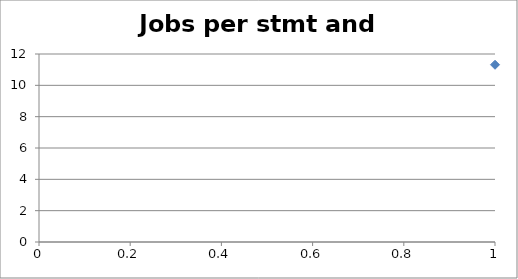
| Category | Series 0 |
|---|---|
| 0 | 11.314 |
| 1 | 6.469 |
| 2 | 6.057 |
| 3 | 4.716 |
| 4 | 4.632 |
| 5 | 4.14 |
| 6 | 3.902 |
| 7 | 3.747 |
| 8 | 3.707 |
| 9 | 3.391 |
| 10 | 3.305 |
| 11 | 3.28 |
| 12 | 3.25 |
| 13 | 3.205 |
| 14 | 3.159 |
| 15 | 3.149 |
| 16 | 3.143 |
| 17 | 3.132 |
| 18 | 3.122 |
| 19 | 3.086 |
| 20 | 3.077 |
| 21 | 3.064 |
| 22 | 2.953 |
| 23 | 2.95 |
| 24 | 2.93 |
| 25 | 2.909 |
| 26 | 2.894 |
| 27 | 2.862 |
| 28 | 2.852 |
| 29 | 2.85 |
| 30 | 2.796 |
| 31 | 2.765 |
| 32 | 2.75 |
| 33 | 2.721 |
| 34 | 2.717 |
| 35 | 2.717 |
| 36 | 2.71 |
| 37 | 2.639 |
| 38 | 2.625 |
| 39 | 2.577 |
| 40 | 2.571 |
| 41 | 2.562 |
| 42 | 2.535 |
| 43 | 2.517 |
| 44 | 2.475 |
| 45 | 2.472 |
| 46 | 2.469 |
| 47 | 2.466 |
| 48 | 2.463 |
| 49 | 2.46 |
| 50 | 2.443 |
| 51 | 2.425 |
| 52 | 2.421 |
| 53 | 2.412 |
| 54 | 2.408 |
| 55 | 2.361 |
| 56 | 2.346 |
| 57 | 2.321 |
| 58 | 2.317 |
| 59 | 2.286 |
| 60 | 2.286 |
| 61 | 2.283 |
| 62 | 2.28 |
| 63 | 2.259 |
| 64 | 2.25 |
| 65 | 2.2 |
| 66 | 2.138 |
| 67 | 2.134 |
| 68 | 2.111 |
| 69 | 2.097 |
| 70 | 2.079 |
| 71 | 2.07 |
| 72 | 2.068 |
| 73 | 2.05 |
| 74 | 2.036 |
| 75 | 2.034 |
| 76 | 2.029 |
| 77 | 2.022 |
| 78 | 2.017 |
| 79 | 2.012 |
| 80 | 1.993 |
| 81 | 1.973 |
| 82 | 1.953 |
| 83 | 1.948 |
| 84 | 1.946 |
| 85 | 1.94 |
| 86 | 1.931 |
| 87 | 1.929 |
| 88 | 1.926 |
| 89 | 1.921 |
| 90 | 1.917 |
| 91 | 1.916 |
| 92 | 1.911 |
| 93 | 1.909 |
| 94 | 1.9 |
| 95 | 1.893 |
| 96 | 1.892 |
| 97 | 1.885 |
| 98 | 1.884 |
| 99 | 1.88 |
| 100 | 1.874 |
| 101 | 1.859 |
| 102 | 1.852 |
| 103 | 1.852 |
| 104 | 1.838 |
| 105 | 1.833 |
| 106 | 1.816 |
| 107 | 1.811 |
| 108 | 1.806 |
| 109 | 1.804 |
| 110 | 1.798 |
| 111 | 1.794 |
| 112 | 1.792 |
| 113 | 1.774 |
| 114 | 1.773 |
| 115 | 1.772 |
| 116 | 1.765 |
| 117 | 1.76 |
| 118 | 1.758 |
| 119 | 1.756 |
| 120 | 1.75 |
| 121 | 1.748 |
| 122 | 1.746 |
| 123 | 1.745 |
| 124 | 1.745 |
| 125 | 1.744 |
| 126 | 1.732 |
| 127 | 1.73 |
| 128 | 1.723 |
| 129 | 1.721 |
| 130 | 1.717 |
| 131 | 1.716 |
| 132 | 1.712 |
| 133 | 1.711 |
| 134 | 1.711 |
| 135 | 1.698 |
| 136 | 1.696 |
| 137 | 1.696 |
| 138 | 1.689 |
| 139 | 1.688 |
| 140 | 1.688 |
| 141 | 1.684 |
| 142 | 1.681 |
| 143 | 1.681 |
| 144 | 1.681 |
| 145 | 1.68 |
| 146 | 1.679 |
| 147 | 1.672 |
| 148 | 1.667 |
| 149 | 1.667 |
| 150 | 1.667 |
| 151 | 1.662 |
| 152 | 1.661 |
| 153 | 1.656 |
| 154 | 1.647 |
| 155 | 1.646 |
| 156 | 1.645 |
| 157 | 1.632 |
| 158 | 1.63 |
| 159 | 1.625 |
| 160 | 1.625 |
| 161 | 1.625 |
| 162 | 1.621 |
| 163 | 1.62 |
| 164 | 1.62 |
| 165 | 1.619 |
| 166 | 1.615 |
| 167 | 1.615 |
| 168 | 1.615 |
| 169 | 1.613 |
| 170 | 1.611 |
| 171 | 1.609 |
| 172 | 1.604 |
| 173 | 1.6 |
| 174 | 1.6 |
| 175 | 1.6 |
| 176 | 1.591 |
| 177 | 1.587 |
| 178 | 1.585 |
| 179 | 1.58 |
| 180 | 1.58 |
| 181 | 1.579 |
| 182 | 1.578 |
| 183 | 1.578 |
| 184 | 1.574 |
| 185 | 1.571 |
| 186 | 1.571 |
| 187 | 1.566 |
| 188 | 1.565 |
| 189 | 1.564 |
| 190 | 1.56 |
| 191 | 1.56 |
| 192 | 1.559 |
| 193 | 1.556 |
| 194 | 1.556 |
| 195 | 1.552 |
| 196 | 1.551 |
| 197 | 1.551 |
| 198 | 1.548 |
| 199 | 1.543 |
| 200 | 1.543 |
| 201 | 1.538 |
| 202 | 1.532 |
| 203 | 1.531 |
| 204 | 1.524 |
| 205 | 1.521 |
| 206 | 1.512 |
| 207 | 1.51 |
| 208 | 1.51 |
| 209 | 1.508 |
| 210 | 1.507 |
| 211 | 1.504 |
| 212 | 1.5 |
| 213 | 1.5 |
| 214 | 1.49 |
| 215 | 1.486 |
| 216 | 1.484 |
| 217 | 1.481 |
| 218 | 1.48 |
| 219 | 1.475 |
| 220 | 1.473 |
| 221 | 1.469 |
| 222 | 1.467 |
| 223 | 1.463 |
| 224 | 1.462 |
| 225 | 1.46 |
| 226 | 1.456 |
| 227 | 1.452 |
| 228 | 1.452 |
| 229 | 1.439 |
| 230 | 1.438 |
| 231 | 1.438 |
| 232 | 1.438 |
| 233 | 1.435 |
| 234 | 1.433 |
| 235 | 1.432 |
| 236 | 1.431 |
| 237 | 1.425 |
| 238 | 1.424 |
| 239 | 1.422 |
| 240 | 1.421 |
| 241 | 1.411 |
| 242 | 1.41 |
| 243 | 1.408 |
| 244 | 1.406 |
| 245 | 1.406 |
| 246 | 1.404 |
| 247 | 1.403 |
| 248 | 1.403 |
| 249 | 1.4 |
| 250 | 1.4 |
| 251 | 1.4 |
| 252 | 1.397 |
| 253 | 1.396 |
| 254 | 1.387 |
| 255 | 1.382 |
| 256 | 1.382 |
| 257 | 1.382 |
| 258 | 1.375 |
| 259 | 1.374 |
| 260 | 1.371 |
| 261 | 1.368 |
| 262 | 1.368 |
| 263 | 1.367 |
| 264 | 1.366 |
| 265 | 1.365 |
| 266 | 1.365 |
| 267 | 1.364 |
| 268 | 1.364 |
| 269 | 1.364 |
| 270 | 1.364 |
| 271 | 1.361 |
| 272 | 1.361 |
| 273 | 1.36 |
| 274 | 1.36 |
| 275 | 1.356 |
| 276 | 1.355 |
| 277 | 1.353 |
| 278 | 1.353 |
| 279 | 1.351 |
| 280 | 1.351 |
| 281 | 1.349 |
| 282 | 1.349 |
| 283 | 1.348 |
| 284 | 1.348 |
| 285 | 1.345 |
| 286 | 1.344 |
| 287 | 1.343 |
| 288 | 1.342 |
| 289 | 1.339 |
| 290 | 1.339 |
| 291 | 1.333 |
| 292 | 1.333 |
| 293 | 1.333 |
| 294 | 1.333 |
| 295 | 1.33 |
| 296 | 1.326 |
| 297 | 1.325 |
| 298 | 1.325 |
| 299 | 1.324 |
| 300 | 1.324 |
| 301 | 1.324 |
| 302 | 1.323 |
| 303 | 1.32 |
| 304 | 1.319 |
| 305 | 1.318 |
| 306 | 1.318 |
| 307 | 1.316 |
| 308 | 1.316 |
| 309 | 1.316 |
| 310 | 1.316 |
| 311 | 1.316 |
| 312 | 1.316 |
| 313 | 1.316 |
| 314 | 1.316 |
| 315 | 1.314 |
| 316 | 1.314 |
| 317 | 1.311 |
| 318 | 1.311 |
| 319 | 1.31 |
| 320 | 1.31 |
| 321 | 1.31 |
| 322 | 1.31 |
| 323 | 1.309 |
| 324 | 1.309 |
| 325 | 1.308 |
| 326 | 1.307 |
| 327 | 1.307 |
| 328 | 1.306 |
| 329 | 1.306 |
| 330 | 1.306 |
| 331 | 1.304 |
| 332 | 1.303 |
| 333 | 1.303 |
| 334 | 1.303 |
| 335 | 1.302 |
| 336 | 1.302 |
| 337 | 1.301 |
| 338 | 1.3 |
| 339 | 1.297 |
| 340 | 1.297 |
| 341 | 1.294 |
| 342 | 1.294 |
| 343 | 1.293 |
| 344 | 1.293 |
| 345 | 1.292 |
| 346 | 1.29 |
| 347 | 1.289 |
| 348 | 1.289 |
| 349 | 1.289 |
| 350 | 1.289 |
| 351 | 1.288 |
| 352 | 1.288 |
| 353 | 1.286 |
| 354 | 1.286 |
| 355 | 1.284 |
| 356 | 1.283 |
| 357 | 1.283 |
| 358 | 1.283 |
| 359 | 1.283 |
| 360 | 1.283 |
| 361 | 1.282 |
| 362 | 1.282 |
| 363 | 1.281 |
| 364 | 1.28 |
| 365 | 1.28 |
| 366 | 1.279 |
| 367 | 1.279 |
| 368 | 1.278 |
| 369 | 1.278 |
| 370 | 1.277 |
| 371 | 1.275 |
| 372 | 1.275 |
| 373 | 1.273 |
| 374 | 1.273 |
| 375 | 1.271 |
| 376 | 1.271 |
| 377 | 1.268 |
| 378 | 1.267 |
| 379 | 1.266 |
| 380 | 1.265 |
| 381 | 1.265 |
| 382 | 1.264 |
| 383 | 1.263 |
| 384 | 1.263 |
| 385 | 1.262 |
| 386 | 1.262 |
| 387 | 1.262 |
| 388 | 1.261 |
| 389 | 1.261 |
| 390 | 1.258 |
| 391 | 1.258 |
| 392 | 1.257 |
| 393 | 1.256 |
| 394 | 1.255 |
| 395 | 1.255 |
| 396 | 1.251 |
| 397 | 1.25 |
| 398 | 1.25 |
| 399 | 1.25 |
| 400 | 1.25 |
| 401 | 1.25 |
| 402 | 1.25 |
| 403 | 1.246 |
| 404 | 1.246 |
| 405 | 1.245 |
| 406 | 1.244 |
| 407 | 1.242 |
| 408 | 1.24 |
| 409 | 1.239 |
| 410 | 1.238 |
| 411 | 1.235 |
| 412 | 1.235 |
| 413 | 1.235 |
| 414 | 1.234 |
| 415 | 1.233 |
| 416 | 1.232 |
| 417 | 1.232 |
| 418 | 1.231 |
| 419 | 1.231 |
| 420 | 1.231 |
| 421 | 1.229 |
| 422 | 1.229 |
| 423 | 1.226 |
| 424 | 1.225 |
| 425 | 1.224 |
| 426 | 1.224 |
| 427 | 1.224 |
| 428 | 1.223 |
| 429 | 1.222 |
| 430 | 1.222 |
| 431 | 1.222 |
| 432 | 1.222 |
| 433 | 1.222 |
| 434 | 1.222 |
| 435 | 1.221 |
| 436 | 1.22 |
| 437 | 1.218 |
| 438 | 1.217 |
| 439 | 1.217 |
| 440 | 1.215 |
| 441 | 1.211 |
| 442 | 1.21 |
| 443 | 1.21 |
| 444 | 1.21 |
| 445 | 1.206 |
| 446 | 1.205 |
| 447 | 1.204 |
| 448 | 1.203 |
| 449 | 1.203 |
| 450 | 1.202 |
| 451 | 1.2 |
| 452 | 1.2 |
| 453 | 1.2 |
| 454 | 1.2 |
| 455 | 1.196 |
| 456 | 1.196 |
| 457 | 1.196 |
| 458 | 1.196 |
| 459 | 1.196 |
| 460 | 1.196 |
| 461 | 1.194 |
| 462 | 1.19 |
| 463 | 1.19 |
| 464 | 1.188 |
| 465 | 1.188 |
| 466 | 1.185 |
| 467 | 1.185 |
| 468 | 1.183 |
| 469 | 1.183 |
| 470 | 1.183 |
| 471 | 1.179 |
| 472 | 1.179 |
| 473 | 1.177 |
| 474 | 1.176 |
| 475 | 1.175 |
| 476 | 1.175 |
| 477 | 1.174 |
| 478 | 1.174 |
| 479 | 1.173 |
| 480 | 1.167 |
| 481 | 1.165 |
| 482 | 1.164 |
| 483 | 1.162 |
| 484 | 1.16 |
| 485 | 1.158 |
| 486 | 1.157 |
| 487 | 1.157 |
| 488 | 1.156 |
| 489 | 1.156 |
| 490 | 1.156 |
| 491 | 1.156 |
| 492 | 1.156 |
| 493 | 1.155 |
| 494 | 1.153 |
| 495 | 1.153 |
| 496 | 1.153 |
| 497 | 1.151 |
| 498 | 1.15 |
| 499 | 1.148 |
| 500 | 1.147 |
| 501 | 1.145 |
| 502 | 1.144 |
| 503 | 1.141 |
| 504 | 1.14 |
| 505 | 1.139 |
| 506 | 1.138 |
| 507 | 1.136 |
| 508 | 1.135 |
| 509 | 1.133 |
| 510 | 1.133 |
| 511 | 1.132 |
| 512 | 1.127 |
| 513 | 1.127 |
| 514 | 1.125 |
| 515 | 1.123 |
| 516 | 1.117 |
| 517 | 1.113 |
| 518 | 1.108 |
| 519 | 1.107 |
| 520 | 1.107 |
| 521 | 1.103 |
| 522 | 1.102 |
| 523 | 1.091 |
| 524 | 1.091 |
| 525 | 1.075 |
| 526 | 1.073 |
| 527 | 1.071 |
| 528 | 1.071 |
| 529 | 1.07 |
| 530 | 1.07 |
| 531 | 1.069 |
| 532 | 1.067 |
| 533 | 1.062 |
| 534 | 1.061 |
| 535 | 1.06 |
| 536 | 1.057 |
| 537 | 1.054 |
| 538 | 1.053 |
| 539 | 1.053 |
| 540 | 1.047 |
| 541 | 1.046 |
| 542 | 1.045 |
| 543 | 1.041 |
| 544 | 1.035 |
| 545 | 1.034 |
| 546 | 1.032 |
| 547 | 1.028 |
| 548 | 1.02 |
| 549 | 0.99 |
| 550 | 0.986 |
| 551 | 0.962 |
| 552 | 0.961 |
| 553 | 0.957 |
| 554 | 0.956 |
| 555 | 0.946 |
| 556 | 0.94 |
| 557 | 0.938 |
| 558 | 0.93 |
| 559 | 0.919 |
| 560 | 0.917 |
| 561 | 0.903 |
| 562 | 0.883 |
| 563 | 0.881 |
| 564 | 0.876 |
| 565 | 0.871 |
| 566 | 0.857 |
| 567 | 0.855 |
| 568 | 0.851 |
| 569 | 0.849 |
| 570 | 0.844 |
| 571 | 0.843 |
| 572 | 0.837 |
| 573 | 0.836 |
| 574 | 0.821 |
| 575 | 0.805 |
| 576 | 0.79 |
| 577 | 0.781 |
| 578 | 0.774 |
| 579 | 0.773 |
| 580 | 0.772 |
| 581 | 0.76 |
| 582 | 0.757 |
| 583 | 0.756 |
| 584 | 0.75 |
| 585 | 0.75 |
| 586 | 0.747 |
| 587 | 0.744 |
| 588 | 0.741 |
| 589 | 0.739 |
| 590 | 0.738 |
| 591 | 0.736 |
| 592 | 0.733 |
| 593 | 0.728 |
| 594 | 0.725 |
| 595 | 0.724 |
| 596 | 0.721 |
| 597 | 0.712 |
| 598 | 0.71 |
| 599 | 0.71 |
| 600 | 0.7 |
| 601 | 0.699 |
| 602 | 0.699 |
| 603 | 0.698 |
| 604 | 0.696 |
| 605 | 0.687 |
| 606 | 0.67 |
| 607 | 0.664 |
| 608 | 0.662 |
| 609 | 0.661 |
| 610 | 0.66 |
| 611 | 0.66 |
| 612 | 0.659 |
| 613 | 0.658 |
| 614 | 0.652 |
| 615 | 0.652 |
| 616 | 0.646 |
| 617 | 0.645 |
| 618 | 0.644 |
| 619 | 0.641 |
| 620 | 0.639 |
| 621 | 0.638 |
| 622 | 0.638 |
| 623 | 0.637 |
| 624 | 0.637 |
| 625 | 0.636 |
| 626 | 0.636 |
| 627 | 0.633 |
| 628 | 0.628 |
| 629 | 0.627 |
| 630 | 0.624 |
| 631 | 0.623 |
| 632 | 0.621 |
| 633 | 0.62 |
| 634 | 0.62 |
| 635 | 0.619 |
| 636 | 0.619 |
| 637 | 0.617 |
| 638 | 0.615 |
| 639 | 0.614 |
| 640 | 0.613 |
| 641 | 0.613 |
| 642 | 0.611 |
| 643 | 0.611 |
| 644 | 0.611 |
| 645 | 0.607 |
| 646 | 0.607 |
| 647 | 0.606 |
| 648 | 0.606 |
| 649 | 0.605 |
| 650 | 0.602 |
| 651 | 0.598 |
| 652 | 0.597 |
| 653 | 0.597 |
| 654 | 0.597 |
| 655 | 0.594 |
| 656 | 0.592 |
| 657 | 0.591 |
| 658 | 0.591 |
| 659 | 0.591 |
| 660 | 0.586 |
| 661 | 0.578 |
| 662 | 0.574 |
| 663 | 0.568 |
| 664 | 0.566 |
| 665 | 0.565 |
| 666 | 0.564 |
| 667 | 0.562 |
| 668 | 0.556 |
| 669 | 0.546 |
| 670 | 0.538 |
| 671 | 0.538 |
| 672 | 0.526 |
| 673 | 0.519 |
| 674 | 0.511 |
| 675 | 0.509 |
| 676 | 0.505 |
| 677 | 0.504 |
| 678 | 0.481 |
| 679 | 0.467 |
| 680 | 0.461 |
| 681 | 0.461 |
| 682 | 0.455 |
| 683 | 0.45 |
| 684 | 0.448 |
| 685 | 0.448 |
| 686 | 0.446 |
| 687 | 0.445 |
| 688 | 0.444 |
| 689 | 0.441 |
| 690 | 0.437 |
| 691 | 0.437 |
| 692 | 0.434 |
| 693 | 0.425 |
| 694 | 0.425 |
| 695 | 0.422 |
| 696 | 0.42 |
| 697 | 0.42 |
| 698 | 0.42 |
| 699 | 0.418 |
| 700 | 0.418 |
| 701 | 0.418 |
| 702 | 0.417 |
| 703 | 0.41 |
| 704 | 0.409 |
| 705 | 0.409 |
| 706 | 0.409 |
| 707 | 0.407 |
| 708 | 0.406 |
| 709 | 0.405 |
| 710 | 0.404 |
| 711 | 0.402 |
| 712 | 0.398 |
| 713 | 0.398 |
| 714 | 0.392 |
| 715 | 0.39 |
| 716 | 0.39 |
| 717 | 0.386 |
| 718 | 0.384 |
| 719 | 0.375 |
| 720 | 0.375 |
| 721 | 0.372 |
| 722 | 0.371 |
| 723 | 0.37 |
| 724 | 0.361 |
| 725 | 0.345 |
| 726 | 0.328 |
| 727 | 0.322 |
| 728 | 0.32 |
| 729 | 0.32 |
| 730 | 0.295 |
| 731 | 0.29 |
| 732 | 0.285 |
| 733 | 0.278 |
| 734 | 0.253 |
| 735 | 0.243 |
| 736 | 0.228 |
| 737 | 0.226 |
| 738 | 0.226 |
| 739 | 0.226 |
| 740 | 0.225 |
| 741 | 0.223 |
| 742 | 0.22 |
| 743 | 0.219 |
| 744 | 0.215 |
| 745 | 0.208 |
| 746 | 0.204 |
| 747 | 0.199 |
| 748 | 0.185 |
| 749 | 0.147 |
| 750 | 0.139 |
| 751 | 0.138 |
| 752 | 0.124 |
| 753 | 0.124 |
| 754 | 0.114 |
| 755 | 0.099 |
| 756 | 0.062 |
| 757 | 0.058 |